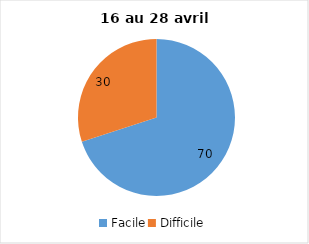
| Category | Series 0 |
|---|---|
| Facile | 70 |
| Difficile | 30 |